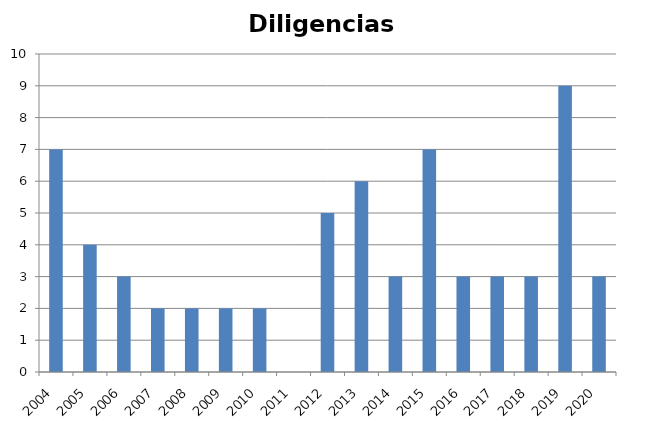
| Category | Diligencias Informativas |
|---|---|
| 2004.0 | 7 |
| 2005.0 | 4 |
| 2006.0 | 3 |
| 2007.0 | 2 |
| 2008.0 | 2 |
| 2009.0 | 2 |
| 2010.0 | 2 |
| 2011.0 | 0 |
| 2012.0 | 5 |
| 2013.0 | 6 |
| 2014.0 | 3 |
| 2015.0 | 7 |
| 2016.0 | 3 |
| 2017.0 | 3 |
| 2018.0 | 3 |
| 2019.0 | 9 |
| 2020.0 | 3 |